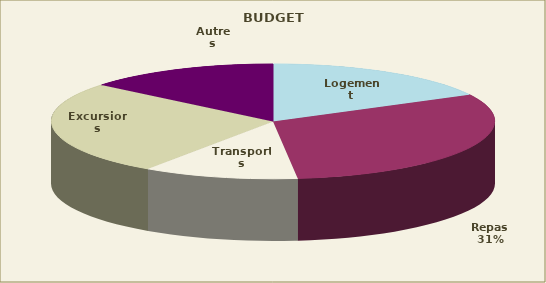
| Category | Series 0 |
|---|---|
| Logement | 90.767 |
| Repas | 162.345 |
| Transports | 59.23 |
| Excursions | 138.793 |
| Autres | 73.725 |